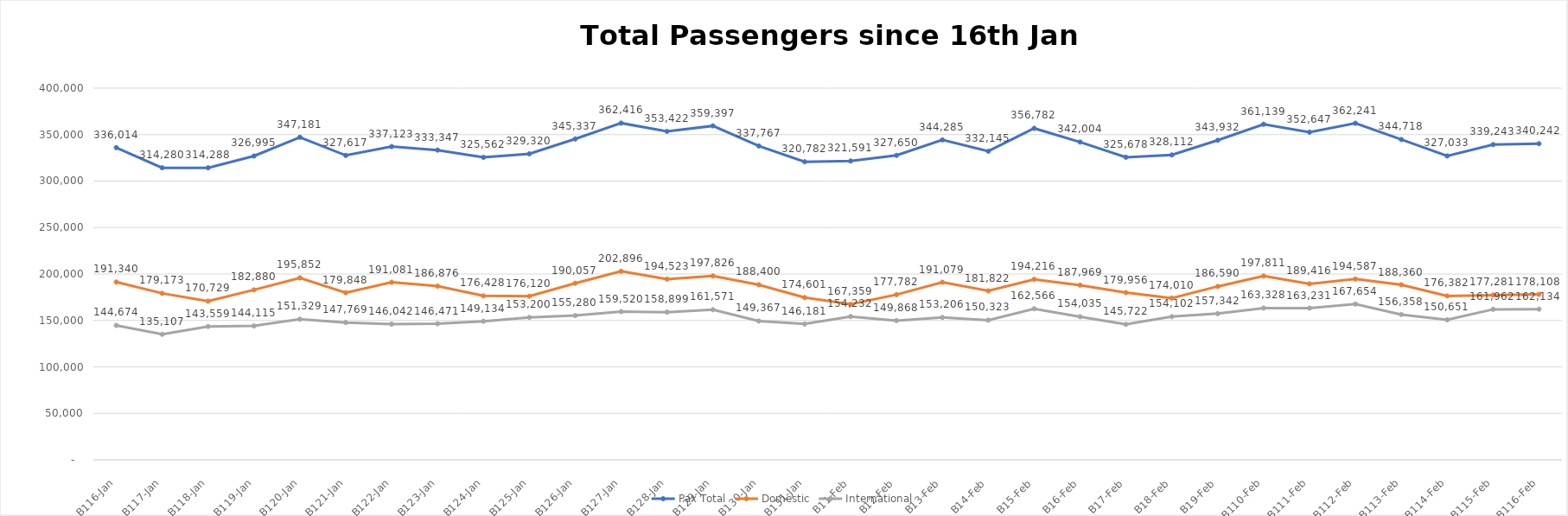
| Category | Pax Total |  Domestic  |  International  |
|---|---|---|---|
| 2023-01-16 | 336014 | 191340 | 144674 |
| 2023-01-17 | 314280 | 179173 | 135107 |
| 2023-01-18 | 314288 | 170729 | 143559 |
| 2023-01-19 | 326995 | 182880 | 144115 |
| 2023-01-20 | 347181 | 195852 | 151329 |
| 2023-01-21 | 327617 | 179848 | 147769 |
| 2023-01-22 | 337123 | 191081 | 146042 |
| 2023-01-23 | 333347 | 186876 | 146471 |
| 2023-01-24 | 325562 | 176428 | 149134 |
| 2023-01-25 | 329320 | 176120 | 153200 |
| 2023-01-26 | 345337 | 190057 | 155280 |
| 2023-01-27 | 362416 | 202896 | 159520 |
| 2023-01-28 | 353422 | 194523 | 158899 |
| 2023-01-29 | 359397 | 197826 | 161571 |
| 2023-01-30 | 337767 | 188400 | 149367 |
| 2023-01-31 | 320782 | 174601 | 146181 |
| 2023-02-01 | 321591 | 167359 | 154232 |
| 2023-02-02 | 327650 | 177782 | 149868 |
| 2023-02-03 | 344285 | 191079 | 153206 |
| 2023-02-04 | 332145 | 181822 | 150323 |
| 2023-02-05 | 356782 | 194216 | 162566 |
| 2023-02-06 | 342004 | 187969 | 154035 |
| 2023-02-07 | 325678 | 179956 | 145722 |
| 2023-02-08 | 328112 | 174010 | 154102 |
| 2023-02-09 | 343932 | 186590 | 157342 |
| 2023-02-10 | 361139 | 197811 | 163328 |
| 2023-02-11 | 352647 | 189416 | 163231 |
| 2023-02-12 | 362241 | 194587 | 167654 |
| 2023-02-13 | 344718 | 188360 | 156358 |
| 2023-02-14 | 327033 | 176382 | 150651 |
| 2023-02-15 | 339243 | 177281 | 161962 |
| 2023-02-16 | 340242 | 178108 | 162134 |